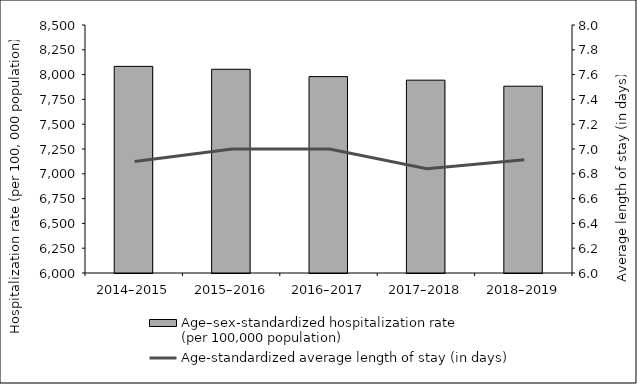
| Category | Age–sex-standardized hospitalization rate 
(per 100,000 population) |
|---|---|
| 2014–2015 | 8083 |
| 2015–2016 | 8053.914 |
| 2016–2017 | 7980 |
| 2017–2018 | 7943.875 |
| 2018–2019 | 7883.11 |